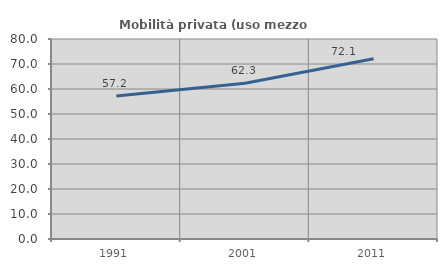
| Category | Mobilità privata (uso mezzo privato) |
|---|---|
| 1991.0 | 57.155 |
| 2001.0 | 62.283 |
| 2011.0 | 72.068 |